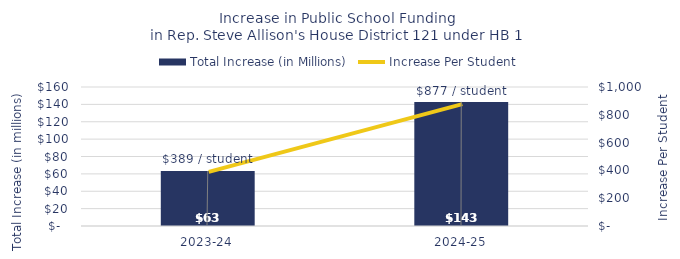
| Category | Total Increase (in Millions) |
|---|---|
| 2023-24 | 63.254 |
| 2024-25 | 142.866 |